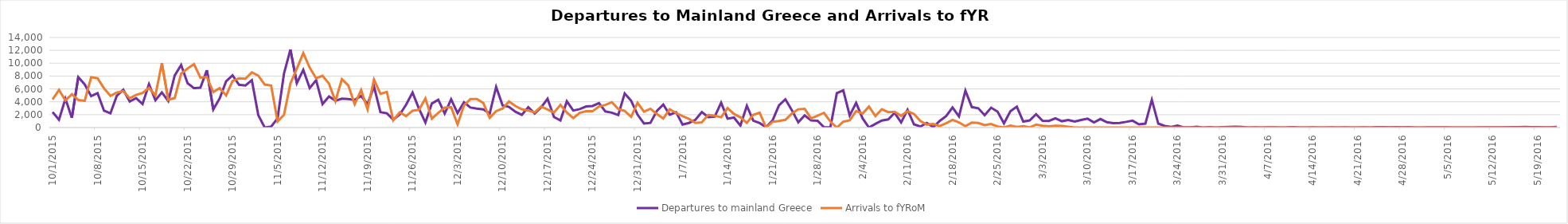
| Category | Departures to mainland Greece | Arrivals to fYRoM |
|---|---|---|
| 10/1/15 | 2409 | 4370 |
| 10/2/15 | 1215 | 5853 |
| 10/3/15 | 4480 | 4202 |
| 10/4/15 | 1513 | 5181 |
| 10/5/15 | 7833 | 4282 |
| 10/6/15 | 6707 | 4156 |
| 10/7/15 | 4886 | 7816 |
| 10/8/15 | 5349 | 7663 |
| 10/9/15 | 2631 | 6107 |
| 10/10/15 | 2214 | 4922 |
| 10/11/15 | 4950 | 5448 |
| 10/12/15 | 5879 | 5645 |
| 10/13/15 | 4052 | 4551 |
| 10/14/15 | 4564 | 5073 |
| 10/15/15 | 3660 | 5373 |
| 10/16/15 | 6743 | 6181 |
| 10/17/15 | 4239 | 4988 |
| 10/18/15 | 5457 | 10005 |
| 10/19/15 | 4119 | 4299 |
| 10/20/15 | 8083 | 4584 |
| 10/21/15 | 9725 | 8384 |
| 10/22/15 | 6896 | 9174 |
| 10/23/15 | 6120 | 9840 |
| 10/24/15 | 6195 | 7752 |
| 10/25/15 | 8916 | 7864 |
| 10/26/15 | 2804 | 5500 |
| 10/27/15 | 4540 | 6146 |
| 10/28/15 | 7191 | 5000 |
| 10/29/15 | 8117 | 7231 |
| 10/30/15 | 6649 | 7663 |
| 10/31/15 | 6537 | 7590 |
| 11/1/15 | 7360 | 8584 |
| 11/2/15 | 1935 | 8075 |
| 11/3/15 | 0 | 6682 |
| 11/4/15 | 142 | 6532 |
| 11/5/15 | 1430 | 960 |
| 11/6/15 | 8392 | 1987 |
| 11/7/15 | 12116 | 6847 |
| 11/8/15 | 6902 | 9148 |
| 11/9/15 | 8977 | 11572 |
| 11/10/15 | 6133 | 9305 |
| 11/11/15 | 7354 | 7651 |
| 11/12/15 | 3650 | 8038 |
| 11/13/15 | 4820 | 6826 |
| 11/14/15 | 4171 | 4107 |
| 11/15/15 | 4497 | 7511 |
| 11/16/15 | 4442 | 6557 |
| 11/17/15 | 4289 | 3621 |
| 11/18/15 | 4927 | 5831 |
| 11/19/15 | 3644 | 2816 |
| 11/20/15 | 6389 | 7453 |
| 11/21/15 | 2401 | 5255 |
| 11/22/15 | 2214 | 5539 |
| 11/23/15 | 1245 | 1113 |
| 11/24/15 | 2006 | 2347 |
| 11/25/15 | 3565 | 1779 |
| 11/26/15 | 5435 | 2617 |
| 11/27/15 | 2932 | 2744 |
| 11/28/15 | 778 | 4520 |
| 11/29/15 | 3736 | 1373 |
| 11/30/15 | 4318 | 2270 |
| 12/1/15 | 2181 | 3094 |
| 12/2/15 | 4384 | 3174 |
| 12/3/15 | 2255 | 494 |
| 12/4/15 | 3934 | 3436 |
| 12/5/15 | 3115 | 4430 |
| 12/6/15 | 2943 | 4425 |
| 12/7/15 | 2810 | 3826 |
| 12/8/15 | 2189 | 1508 |
| 12/9/15 | 6316 | 2550 |
| 12/10/15 | 3456 | 2956 |
| 12/11/15 | 3219 | 4047 |
| 12/12/15 | 2453 | 3338 |
| 12/13/15 | 1976 | 2849 |
| 12/14/15 | 3175 | 2644 |
| 12/15/15 | 2191 | 2349 |
| 12/16/15 | 3137 | 3264 |
| 12/17/15 | 4461 | 2801 |
| 12/18/15 | 1638 | 2332 |
| 12/19/15 | 1110 | 3515 |
| 12/20/15 | 4070 | 2338 |
| 12/21/15 | 2652 | 1470 |
| 12/22/15 | 2864 | 2272 |
| 12/23/15 | 3278 | 2529 |
| 12/24/15 | 3349 | 2529 |
| 12/25/15 | 3806 | 3268 |
| 12/26/15 | 2498 | 3521 |
| 12/27/15 | 2311 | 3938 |
| 12/28/15 | 1946 | 2884 |
| 12/29/15 | 5309 | 2577 |
| 12/30/15 | 4178 | 1665 |
| 12/31/15 | 2009 | 3848 |
| 1/1/16 | 623 | 2454 |
| 1/2/16 | 720 | 2918 |
| 1/3/16 | 2569 | 2112 |
| 1/4/16 | 3563 | 1415 |
| 1/5/16 | 1998 | 2842 |
| 1/6/16 | 2377 | 2258 |
| 1/7/16 | 463 | 1776 |
| 1/8/16 | 716 | 1344 |
| 1/9/16 | 1203 | 715 |
| 1/10/16 | 2417 | 819 |
| 1/11/16 | 1621 | 1959 |
| 1/12/16 | 1701 | 1840 |
| 1/13/16 | 3861 | 1600 |
| 1/14/16 | 1378 | 3022 |
| 1/15/16 | 1551 | 2119 |
| 1/16/16 | 301 | 1598 |
| 1/17/16 | 3378 | 720 |
| 1/18/16 | 1078 | 1980 |
| 1/19/16 | 695 | 2298 |
| 1/20/16 | 50 | 0 |
| 1/21/16 | 1108 | 892 |
| 1/22/16 | 3451 | 1030 |
| 1/23/16 | 4397 | 1208 |
| 1/24/16 | 2706 | 2174 |
| 1/25/16 | 819 | 2836 |
| 1/26/16 | 1887 | 2908 |
| 1/27/16 | 1098 | 1402 |
| 1/28/16 | 1046 | 1837 |
| 1/29/16 | 40 | 2292 |
| 1/30/16 | 53 | 931 |
| 1/31/16 | 5342 | 0 |
| 2/1/16 | 5783 | 908 |
| 2/2/16 | 1878 | 1121 |
| 2/3/16 | 3829 | 2558 |
| 2/4/16 | 1436 | 2173 |
| 2/5/16 | 0 | 3259 |
| 2/6/16 | 578 | 1780 |
| 2/7/16 | 1097 | 2838 |
| 2/8/16 | 1259 | 2392 |
| 2/9/16 | 2283 | 2441 |
| 2/10/16 | 793 | 1817 |
| 2/11/16 | 2756 | 2540 |
| 2/12/16 | 496 | 2115 |
| 2/13/16 | 161 | 1019 |
| 2/14/16 | 724 | 452 |
| 2/15/16 | 65 | 542 |
| 2/16/16 | 1024 | 234 |
| 2/17/16 | 1772 | 668 |
| 2/18/16 | 3118 | 1200 |
| 2/19/16 | 1731 | 799 |
| 2/20/16 | 5738 | 209 |
| 2/21/16 | 3180 | 774 |
| 2/22/16 | 3002 | 714 |
| 2/23/16 | 1927 | 382 |
| 2/24/16 | 3086 | 551 |
| 2/25/16 | 2468 | 168 |
| 2/26/16 | 649 | 20 |
| 2/27/16 | 2525 | 310 |
| 2/28/16 | 3234 | 92 |
| 2/29/16 | 920 | 208 |
| 3/1/16 | 1107 | 30 |
| 3/2/16 | 2073 | 457 |
| 3/3/16 | 1061 | 269 |
| 3/4/16 | 1035 | 177 |
| 3/5/16 | 1444 | 293 |
| 3/6/16 | 980 | 261 |
| 3/7/16 | 1171 | 127 |
| 3/8/16 | 922 | 0 |
| 3/9/16 | 1169 | 0 |
| 3/10/16 | 1381 | 0 |
| 3/11/16 | 810 | 0 |
| 3/12/16 | 1326 | 0 |
| 3/13/16 | 831 | 0 |
| 3/14/16 | 693 | 0 |
| 3/15/16 | 721 | 0 |
| 3/16/16 | 882 | 0 |
| 3/17/16 | 1068 | 0 |
| 3/18/16 | 489 | 0 |
| 3/19/16 | 608 | 0 |
| 3/20/16 | 4314 | 0 |
| 3/21/16 | 616 | 0 |
| 3/22/16 | 254 | 0 |
| 3/23/16 | 95 | 0 |
| 3/24/16 | 316 | 0 |
| 3/25/16 | 22 | 0 |
| 3/26/16 | 25 | 0 |
| 3/27/16 | 113 | 0 |
| 3/28/16 | 0 | 0 |
| 3/29/16 | 76 | 0 |
| 3/30/16 | 11 | 0 |
| 3/31/16 | 68 | 0 |
| 4/1/16 | 102 | 0 |
| 4/2/16 | 132 | 0 |
| 4/3/16 | 105 | 0 |
| 4/4/16 | 0 | 0 |
| 4/5/16 | 31 | 0 |
| 4/6/16 | 7 | 0 |
| 4/7/16 | 32 | 0 |
| 4/8/16 | 17 | 0 |
| 4/9/16 | 14 | 0 |
| 4/10/16 | 16 | 0 |
| 4/11/16 | 64 | 0 |
| 4/12/16 | 5 | 0 |
| 4/13/16 | 10 | 0 |
| 4/14/16 | 36 | 0 |
| 4/15/16 | 0 | 0 |
| 4/16/16 | 0 | 0 |
| 4/17/16 | 34 | 0 |
| 4/18/16 | 9 | 0 |
| 4/19/16 | 39 | 0 |
| 4/20/16 | 7 | 0 |
| 4/21/16 | 7 | 0 |
| 4/22/16 | 16 | 0 |
| 4/23/16 | 0 | 0 |
| 4/24/16 | 51 | 0 |
| 4/25/16 | 54 | 0 |
| 4/26/16 | 17 | 0 |
| 4/27/16 | 52 | 0 |
| 4/28/16 | 16 | 0 |
| 4/29/16 | 56 | 0 |
| 4/30/16 | 4 | 0 |
| 5/1/16 | 0 | 0 |
| 5/2/16 | 25 | 0 |
| 5/3/16 | 34 | 0 |
| 5/4/16 | 41 | 0 |
| 5/5/16 | 37 | 0 |
| 5/6/16 | 1 | 0 |
| 5/7/16 | 0 | 0 |
| 5/8/16 | 0 | 0 |
| 5/9/16 | 5 | 0 |
| 5/10/16 | 46 | 0 |
| 5/11/16 | 40 | 0 |
| 5/12/16 | 39 | 0 |
| 5/13/16 | 31 | 0 |
| 5/14/16 | 22 | 0 |
| 5/15/16 | 75 | 0 |
| 5/16/16 | 51 | 0 |
| 5/17/16 | 88 | 0 |
| 5/18/16 | 64 | 0 |
| 5/19/16 | 62 | 0 |
| 5/20/16 | 39 | 0 |
| 5/21/16 | 31 | 0 |
| 5/22/16 | 93 | 0 |